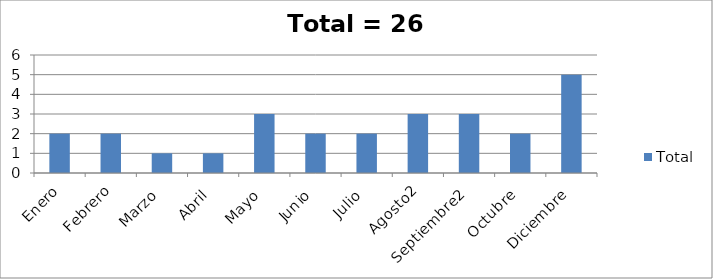
| Category | Total |
|---|---|
| Enero | 2 |
| Febrero | 2 |
| Marzo | 1 |
| Abril | 1 |
| Mayo | 3 |
| Junio | 2 |
| Julio | 2 |
| Agosto2 | 3 |
| Septiembre2 | 3 |
| Octubre | 2 |
| Diciembre | 5 |